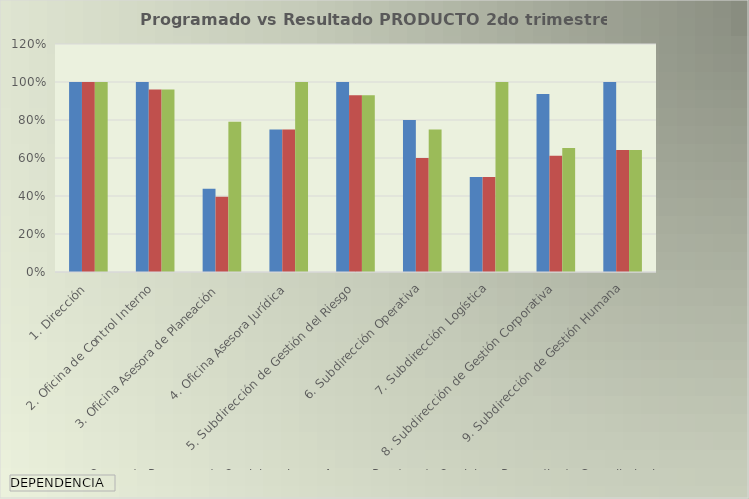
| Category | Suma de Programado 3er trimestre | Avance Ponderado 3er tri. | Promedio de Cumplimiento |
|---|---|---|---|
| 1. Dirección | 1 | 1 | 1 |
| 2. Oficina de Control Interno | 1 | 0.96 | 0.96 |
| 3. Oficina Asesora de Planeación | 0.438 | 0.395 | 0.791 |
| 4. Oficina Asesora Jurídica | 0.75 | 0.75 | 1 |
| 5. Subdirección de Gestión del Riesgo | 1 | 0.931 | 0.931 |
| 6. Subdirección Operativa | 0.8 | 0.6 | 0.75 |
| 7. Subdirección Logística | 0.5 | 0.5 | 1 |
| 8. Subdirección de Gestión Corporativa | 0.938 | 0.612 | 0.652 |
| 9. Subdirección de Gestión Humana | 1 | 0.642 | 0.642 |